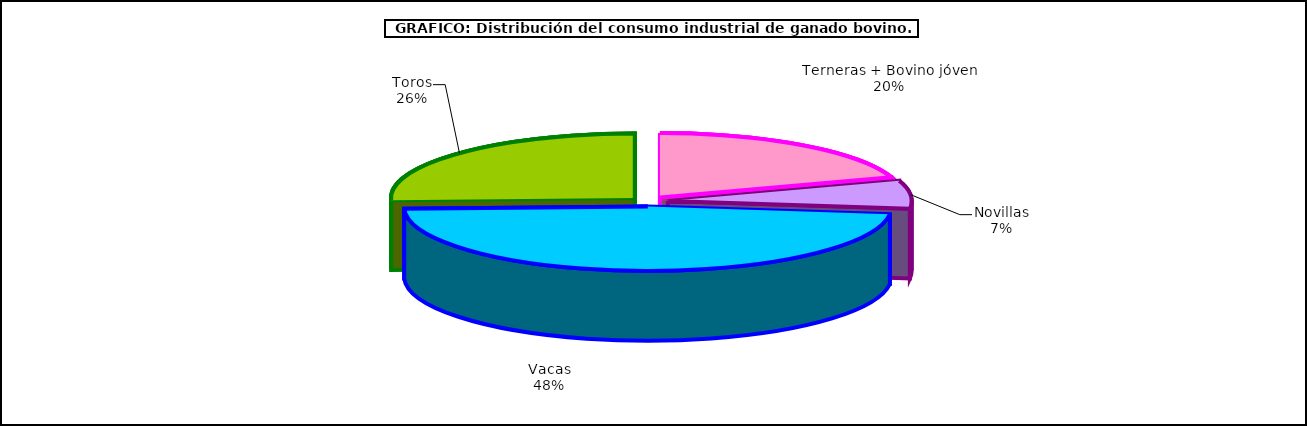
| Category | Series 0 |
|---|---|
| Terneras + Bovino jóven | 14476.831 |
| Novillas | 5103.898 |
| Vacas | 34595.19 |
| Toros | 18581.722 |